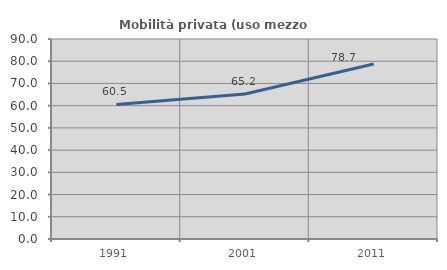
| Category | Mobilità privata (uso mezzo privato) |
|---|---|
| 1991.0 | 60.533 |
| 2001.0 | 65.243 |
| 2011.0 | 78.715 |